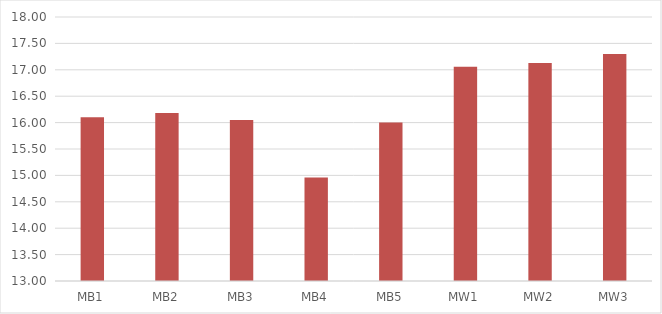
| Category | Series 0 |
|---|---|
| MB1 | 16.1 |
| MB2 | 16.18 |
| MB3 | 16.05 |
| MB4 | 14.96 |
| MB5 | 16 |
| MW1 | 17.06 |
| MW2 | 17.13 |
| MW3 | 17.3 |